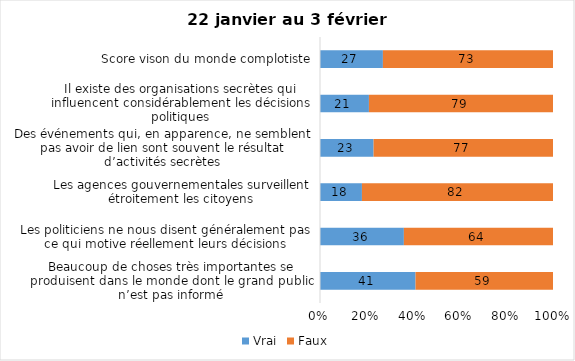
| Category | Vrai | Faux |
|---|---|---|
| Beaucoup de choses très importantes se produisent dans le monde dont le grand public n’est pas informé | 41 | 59 |
| Les politiciens ne nous disent généralement pas ce qui motive réellement leurs décisions | 36 | 64 |
| Les agences gouvernementales surveillent étroitement les citoyens | 18 | 82 |
| Des événements qui, en apparence, ne semblent pas avoir de lien sont souvent le résultat d’activités secrètes | 23 | 77 |
| Il existe des organisations secrètes qui influencent considérablement les décisions politiques | 21 | 79 |
| Score vison du monde complotiste | 27 | 73 |